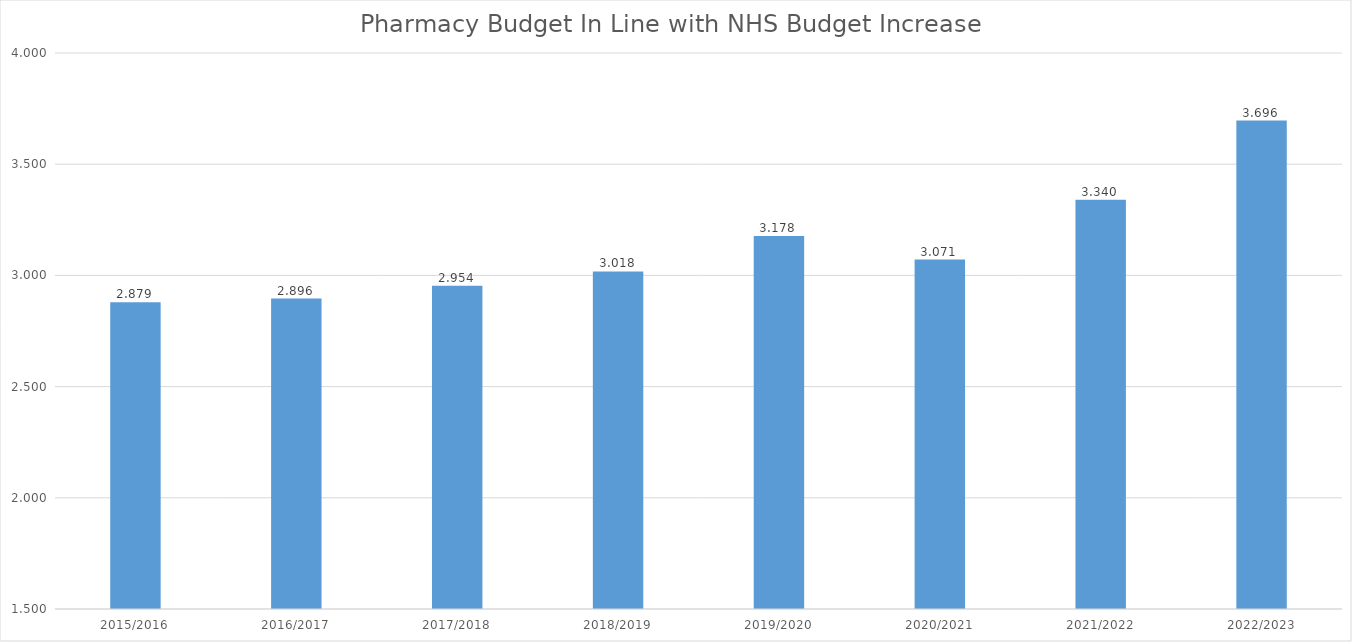
| Category | Series 0 |
|---|---|
| 2015/2016 | 2.879 |
| 2016/2017 | 2.896 |
| 2017/2018 | 2.954 |
| 2018/2019 | 3.018 |
| 2019/2020 | 3.178 |
| 2020/2021 | 3.071 |
| 2021/2022 | 3.34 |
| 2022/2023 | 3.696 |